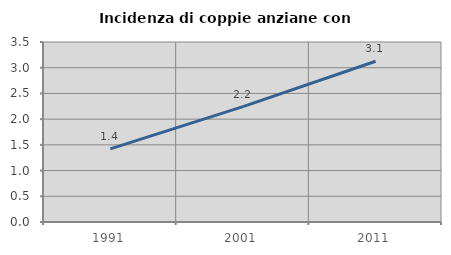
| Category | Incidenza di coppie anziane con figli |
|---|---|
| 1991.0 | 1.422 |
| 2001.0 | 2.244 |
| 2011.0 | 3.125 |